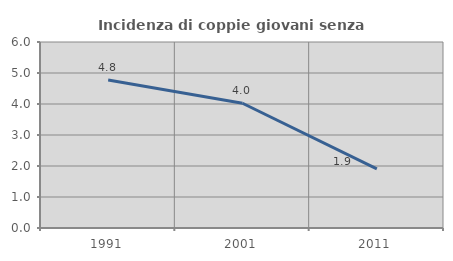
| Category | Incidenza di coppie giovani senza figli |
|---|---|
| 1991.0 | 4.777 |
| 2001.0 | 4.025 |
| 2011.0 | 1.905 |